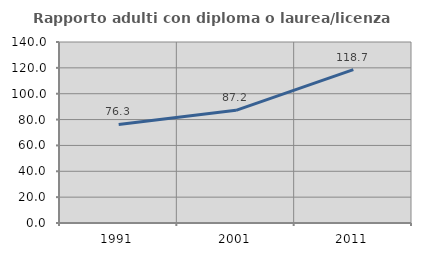
| Category | Rapporto adulti con diploma o laurea/licenza media  |
|---|---|
| 1991.0 | 76.25 |
| 2001.0 | 87.156 |
| 2011.0 | 118.657 |